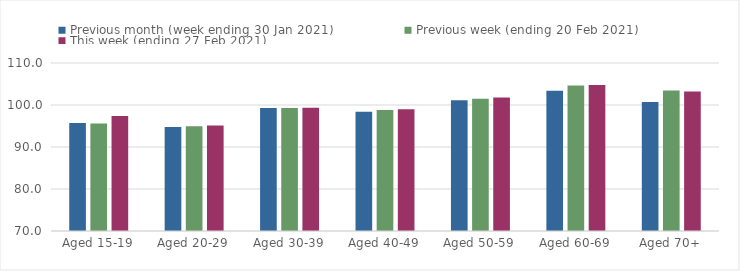
| Category | Previous month (week ending 30 Jan 2021) | Previous week (ending 20 Feb 2021) | This week (ending 27 Feb 2021) |
|---|---|---|---|
| Aged 15-19 | 95.72 | 95.62 | 97.4 |
| Aged 20-29 | 94.78 | 94.94 | 95.11 |
| Aged 30-39 | 99.31 | 99.29 | 99.36 |
| Aged 40-49 | 98.42 | 98.8 | 98.97 |
| Aged 50-59 | 101.12 | 101.47 | 101.81 |
| Aged 60-69 | 103.41 | 104.64 | 104.79 |
| Aged 70+ | 100.74 | 103.43 | 103.19 |